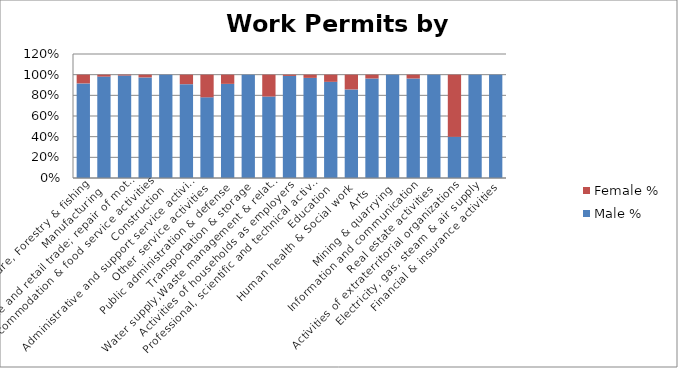
| Category | Male % | Female % |
|---|---|---|
| Agriculture, Forestry & fishing | 0.915 | 0.085 |
|  Manufacturing | 0.981 | 0.019 |
|  Wholesale and retail trade; repair of motor vehicles  | 0.992 | 0.008 |
|   Accommodation & food service activities | 0.973 | 0.027 |
|   Construction | 1 | 0 |
| Administrative and support service activities | 0.908 | 0.092 |
| Other service activities | 0.781 | 0.219 |
| Public administration & defense | 0.911 | 0.089 |
|   Transportation & storage | 1 | 0 |
| Water supply,Waste management & related activities | 0.788 | 0.212 |
| Activities of households as employers | 0.988 | 0.012 |
| Professional, scientific and technical activities | 0.969 | 0.031 |
| Education | 0.931 | 0.069 |
| Human health & Social work | 0.857 | 0.143 |
| Arts | 0.963 | 0.037 |
| Mining & quarrying | 1 | 0 |
|  Information and communication | 0.963 | 0.037 |
| Real estate activities | 1 | 0 |
| Activities of extraterritorial organizations  | 0.399 | 0.601 |
| Electricity, gas, steam & air supply | 1 | 0 |
|  Financial & insurance activities | 1 | 0 |